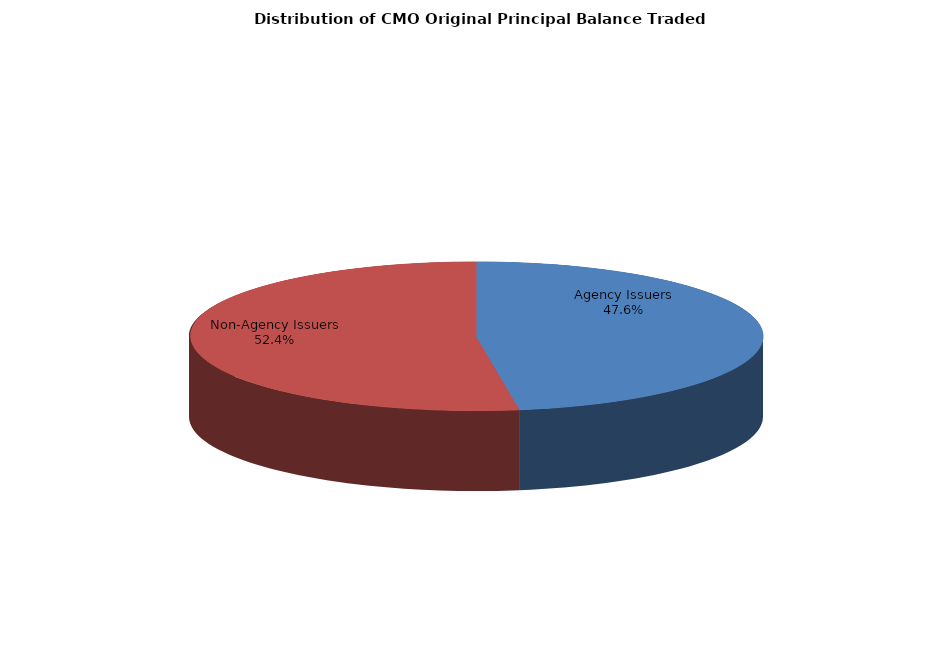
| Category | Series 0 |
|---|---|
| Agency Issuers | 5355304825.656 |
| Non-Agency Issuers | 5899780884.92 |